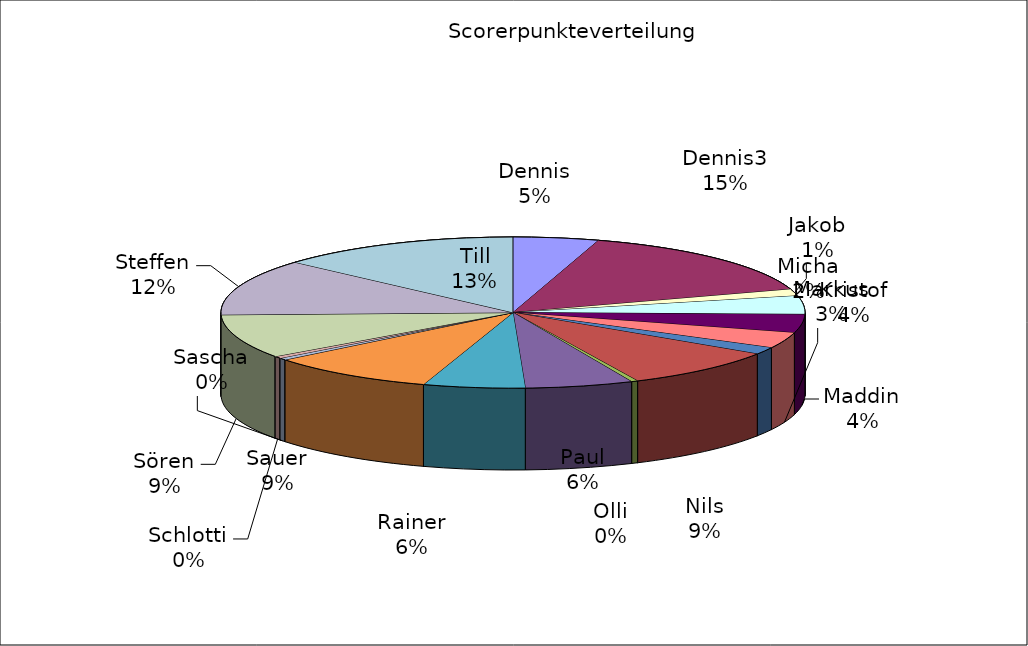
| Category | Series 0 |
|---|---|
| Dennis | 53 |
| Dennis3 | 171 |
| Jakob | 16 |
| Kristof | 44 |
| Maddin | 44 |
| Markus | 38 |
| Micha | 17 |
| Nils | 98 |
| Olli | 4 |
| Paul | 67 |
| Rainer | 63 |
| Sauer | 104 |
| Sascha | 5 |
| Schlotti | 5 |
| Sören | 105 |
| Steffen | 135 |
| Till | 150 |